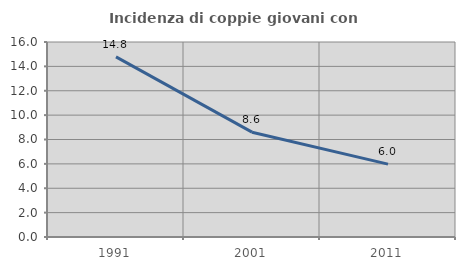
| Category | Incidenza di coppie giovani con figli |
|---|---|
| 1991.0 | 14.776 |
| 2001.0 | 8.601 |
| 2011.0 | 5.981 |